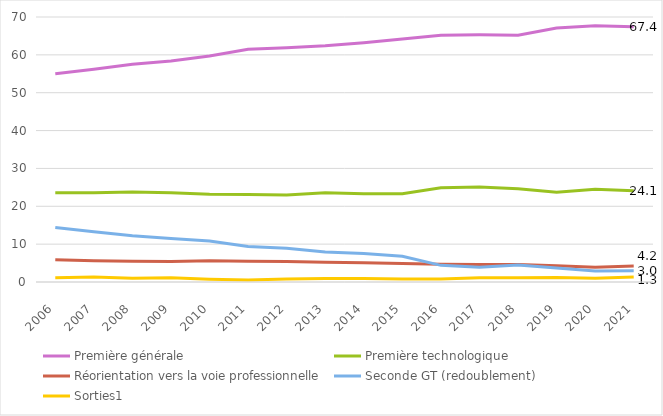
| Category | Première générale       | Première technologique          | Réorientation vers la voie professionnelle | Seconde GT (redoublement)    | Sorties1 |
|---|---|---|---|---|---|
| 2006.0 | 55 | 23.6 | 5.9 | 14.4 | 1.1 |
| 2007.0 | 56.2 | 23.6 | 5.6 | 13.3 | 1.3 |
| 2008.0 | 57.5 | 23.8 | 5.5 | 12.2 | 1 |
| 2009.0 | 58.4 | 23.6 | 5.4 | 11.5 | 1.1 |
| 2010.0 | 59.7 | 23.2 | 5.6 | 10.8 | 0.7 |
| 2011.0 | 61.5 | 23.1 | 5.5 | 9.4 | 0.5 |
| 2012.0 | 61.9 | 23 | 5.4 | 8.9 | 0.8 |
| 2013.0 | 62.4 | 23.6 | 5.2 | 7.9 | 0.9 |
| 2014.0 | 63.2 | 23.3 | 5.1 | 7.5 | 0.9 |
| 2015.0 | 64.2 | 23.3 | 4.9 | 6.8 | 0.8 |
| 2016.0 | 65.2 | 24.9 | 4.7 | 4.4 | 0.8 |
| 2017.0 | 65.3 | 25.1 | 4.6 | 3.9 | 1.1 |
| 2018.0 | 65.2 | 24.6 | 4.6 | 4.5 | 1.1 |
| 2019.0 | 67.1 | 23.7 | 4.3 | 3.7 | 1.2 |
| 2020.0 | 67.7 | 24.5 | 3.9 | 2.9 | 1 |
| 2021.0 | 67.4 | 24.1 | 4.2 | 3 | 1.3 |